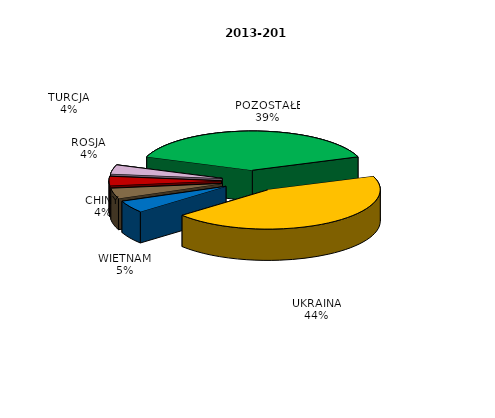
| Category | Series 0 |
|---|---|
| UKRAINA | 2579 |
| WIETNAM | 291 |
| CHINY | 249 |
| ROSJA | 221 |
| TURCJA | 217 |
| POZOSTAŁE | 2260 |